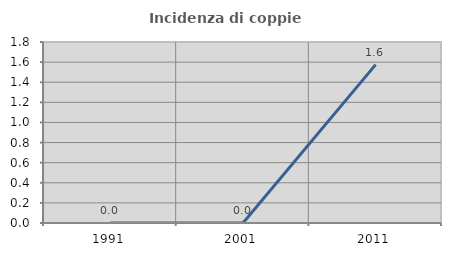
| Category | Incidenza di coppie miste |
|---|---|
| 1991.0 | 0 |
| 2001.0 | 0 |
| 2011.0 | 1.575 |